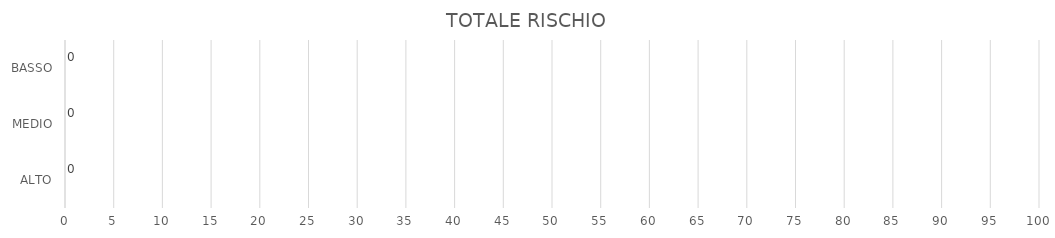
| Category | Series 1 | Series 0 |
|---|---|---|
| ALTO | 0 | 0 |
| MEDIO | 0 | 0 |
| BASSO | 0 | 0 |